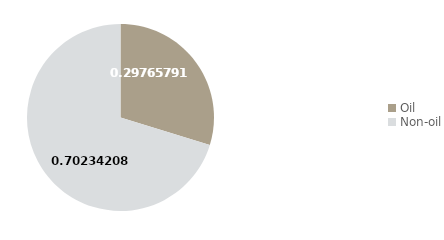
| Category | Q2 2017 |
|---|---|
| Oil | 29.766 |
| Non-oil | 70.234 |